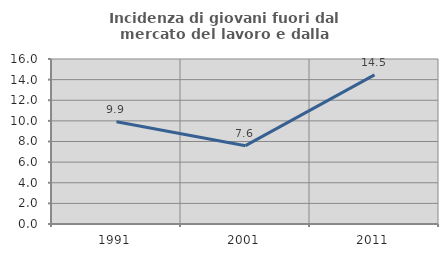
| Category | Incidenza di giovani fuori dal mercato del lavoro e dalla formazione  |
|---|---|
| 1991.0 | 9.917 |
| 2001.0 | 7.595 |
| 2011.0 | 14.458 |